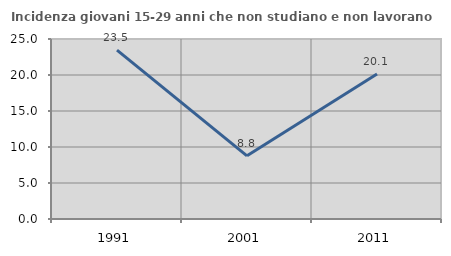
| Category | Incidenza giovani 15-29 anni che non studiano e non lavorano  |
|---|---|
| 1991.0 | 23.462 |
| 2001.0 | 8.776 |
| 2011.0 | 20.133 |